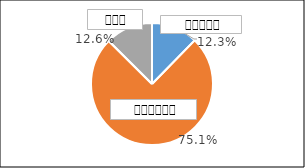
| Category | Series 0 |
|---|---|
| 0 | 0.123 |
| 1 | 0.751 |
| 2 | 0.126 |